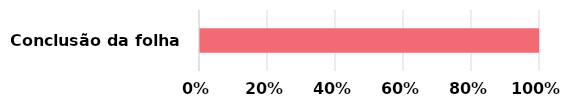
| Category | Conclusão da folha | Series 1 |
|---|---|---|
| Conclusão da folha | 0 | 1 |